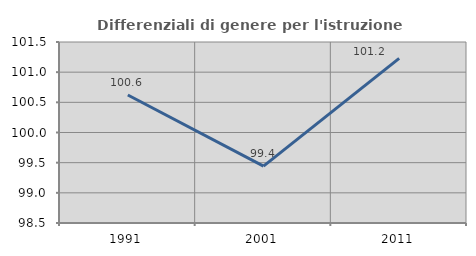
| Category | Differenziali di genere per l'istruzione superiore |
|---|---|
| 1991.0 | 100.621 |
| 2001.0 | 99.443 |
| 2011.0 | 101.229 |